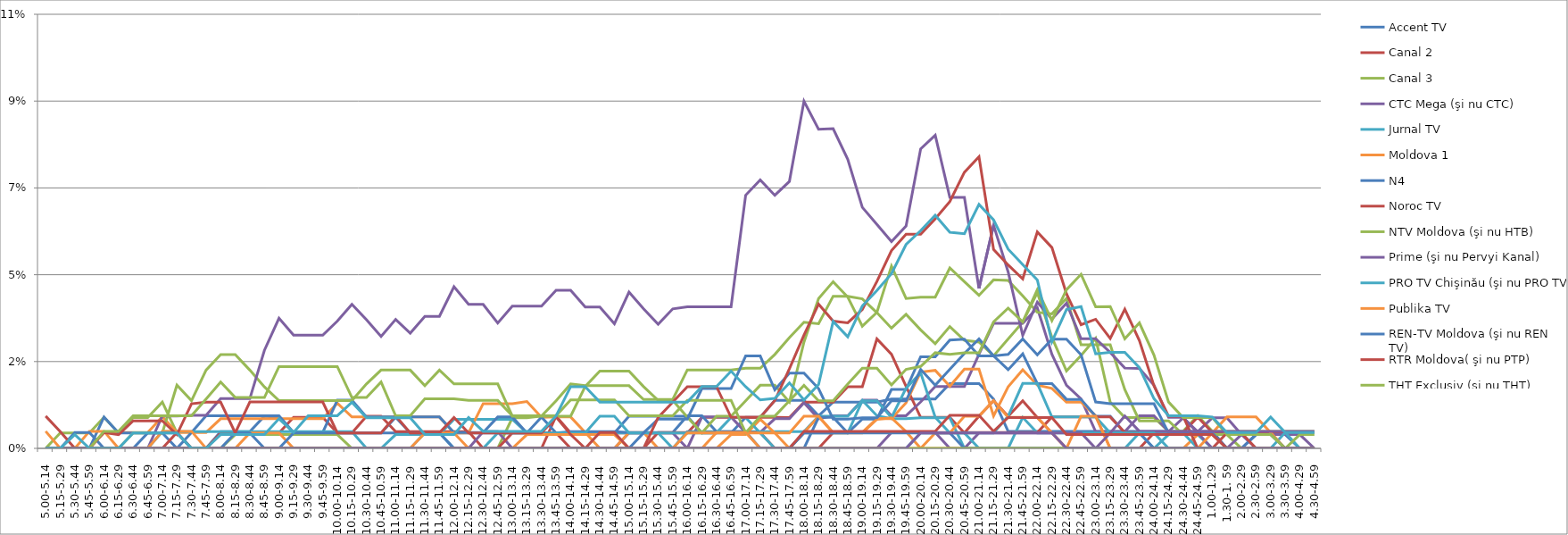
| Category | Accent TV | Canal 2 | Canal 3 | CTC Mega (şi nu CTC) | Jurnal TV | Moldova 1 | N4 | Noroc TV | NTV Moldova (şi nu HTB) | Prime (şi nu Pervyi Kanal) | PRO TV Chişinău (şi nu PRO TV) | Publika TV  | REN-TV Moldova (şi nu REN TV)  | RTR Moldova( şi nu PTP)  | THT Exclusiv (şi nu THT) | TV8 | TVC 21 | TVR MOLDOVA (şi nu TVR) | Canal Regional | Familia Domashniy | ITV | Moldova 2 | Alt canal |
|---|---|---|---|---|---|---|---|---|---|---|---|---|---|---|---|---|---|---|---|---|---|---|---|
| 5.00-5.14 | 0 | 0 | 0 | 0 | 0 | 0 | 0 | 0 | 0 | 0 | 0 | 0.004 | 0 | 0.008 | 0 | 0 | 0 | 0 | 0 | 0 | 0 | 0 | 0 |
| 5.15-5.29 | 0 | 0 | 0.004 | 0 | 0 | 0 | 0 | 0 | 0 | 0 | 0 | 0 | 0 | 0.004 | 0 | 0 | 0 | 0 | 0 | 0 | 0 | 0 | 0 |
| 5.30-5.44 | 0 | 0 | 0.004 | 0 | 0 | 0 | 0 | 0 | 0 | 0 | 0 | 0 | 0.004 | 0 | 0 | 0 | 0 | 0 | 0 | 0 | 0 | 0 | 0.004 |
| 5.45-5.59 | 0 | 0 | 0.004 | 0 | 0 | 0 | 0 | 0 | 0 | 0 | 0 | 0.004 | 0.004 | 0 | 0 | 0 | 0 | 0 | 0 | 0 | 0 | 0 | 0 |
| 6.00-6.14 | 0 | 0 | 0.008 | 0 | 0 | 0.004 | 0.008 | 0 | 0 | 0 | 0 | 0.004 | 0 | 0.004 | 0.004 | 0 | 0 | 0 | 0 | 0 | 0 | 0 | 0 |
| 6.15-6.29 | 0 | 0 | 0.004 | 0 | 0 | 0.004 | 0.004 | 0 | 0 | 0 | 0 | 0 | 0 | 0.004 | 0.004 | 0 | 0 | 0 | 0 | 0 | 0 | 0 | 0 |
| 6.30-6.44 | 0 | 0 | 0.008 | 0 | 0 | 0.004 | 0.004 | 0 | 0.004 | 0 | 0 | 0 | 0 | 0.007 | 0.008 | 0 | 0 | 0 | 0 | 0 | 0 | 0 | 0.004 |
| 6.45-6.59 | 0 | 0 | 0.008 | 0 | 0 | 0.004 | 0.004 | 0 | 0.004 | 0 | 0 | 0 | 0.004 | 0.007 | 0.008 | 0 | 0 | 0 | 0 | 0 | 0 | 0 | 0.004 |
| 7.00-7.14 | 0 | 0 | 0.012 | 0 | 0 | 0.008 | 0.004 | 0 | 0.004 | 0.008 | 0.004 | 0.004 | 0.004 | 0.007 | 0.008 | 0 | 0 | 0 | 0 | 0 | 0 | 0 | 0.004 |
| 7.15-7.29 | 0 | 0 | 0.004 | 0 | 0 | 0.004 | 0 | 0.004 | 0.016 | 0.008 | 0.004 | 0.004 | 0.004 | 0.004 | 0.008 | 0 | 0 | 0 | 0 | 0 | 0 | 0 | 0.004 |
| 7.30-7.44 | 0 | 0 | 0 | 0 | 0 | 0.004 | 0.004 | 0 | 0.012 | 0.009 | 0.004 | 0.004 | 0 | 0.012 | 0.008 | 0 | 0 | 0 | 0 | 0 | 0 | 0 | 0 |
| 7.45-7.59 | 0 | 0 | 0 | 0 | 0 | 0.004 | 0.008 | 0 | 0.02 | 0.009 | 0.004 | 0 | 0 | 0.012 | 0.013 | 0 | 0 | 0 | 0 | 0 | 0 | 0 | 0 |
| 8.00-8.14 | 0.004 | 0.004 | 0 | 0 | 0 | 0.008 | 0.008 | 0 | 0.024 | 0.013 | 0.004 | 0 | 0 | 0.012 | 0.017 | 0 | 0 | 0 | 0 | 0 | 0 | 0 | 0.004 |
| 8.15-8.29 | 0.004 | 0.004 | 0.004 | 0 | 0 | 0.008 | 0.008 | 0 | 0.024 | 0.013 | 0.004 | 0 | 0.004 | 0.004 | 0.013 | 0 | 0 | 0 | 0 | 0 | 0 | 0 | 0.004 |
| 8.30-8.44 | 0.004 | 0.004 | 0.004 | 0 | 0 | 0.008 | 0.008 | 0 | 0.02 | 0.013 | 0.004 | 0.004 | 0.004 | 0.012 | 0.013 | 0 | 0 | 0 | 0 | 0 | 0 | 0 | 0.004 |
| 8.45-8.59 | 0.008 | 0.004 | 0.004 | 0 | 0 | 0.008 | 0.008 | 0 | 0.016 | 0.025 | 0.004 | 0.004 | 0 | 0.012 | 0.013 | 0 | 0 | 0 | 0 | 0 | 0 | 0 | 0.004 |
| 9.00-9.14 | 0.008 | 0.004 | 0.004 | 0 | 0 | 0.008 | 0.008 | 0 | 0.012 | 0.034 | 0.004 | 0.004 | 0 | 0.012 | 0.021 | 0 | 0 | 0 | 0 | 0 | 0 | 0 | 0.008 |
| 9.15-9.29 | 0.004 | 0.008 | 0.004 | 0 | 0 | 0.008 | 0.004 | 0 | 0.012 | 0.029 | 0.004 | 0 | 0.004 | 0.012 | 0.021 | 0 | 0 | 0 | 0 | 0 | 0 | 0 | 0.004 |
| 9.30-9.44 | 0.004 | 0.008 | 0.004 | 0 | 0 | 0.008 | 0.004 | 0 | 0.012 | 0.029 | 0.004 | 0 | 0.004 | 0.012 | 0.021 | 0 | 0 | 0 | 0 | 0 | 0 | 0 | 0.008 |
| 9.45-9.59 | 0.004 | 0.008 | 0.004 | 0 | 0 | 0.008 | 0.004 | 0 | 0.012 | 0.029 | 0.004 | 0 | 0.004 | 0.012 | 0.021 | 0 | 0 | 0 | 0 | 0 | 0 | 0 | 0.008 |
| 10.00-10.14 | 0.004 | 0.004 | 0.004 | 0 | 0 | 0.012 | 0.012 | 0 | 0.012 | 0.033 | 0.004 | 0 | 0.004 | 0.004 | 0.021 | 0 | 0 | 0 | 0 | 0 | 0 | 0 | 0.008 |
| 10.15-10.29 | 0.004 | 0.004 | 0 | 0 | 0 | 0.008 | 0.012 | 0 | 0.012 | 0.037 | 0.004 | 0 | 0.004 | 0.004 | 0.013 | 0 | 0 | 0 | 0 | 0 | 0 | 0 | 0.012 |
| 10.30-10.44 | 0.004 | 0.008 | 0 | 0 | 0 | 0.008 | 0.008 | 0 | 0.017 | 0.033 | 0 | 0 | 0.004 | 0.004 | 0.013 | 0 | 0 | 0 | 0 | 0 | 0 | 0 | 0.008 |
| 10.45-10.59 | 0.004 | 0.008 | 0 | 0 | 0 | 0.008 | 0.008 | 0 | 0.02 | 0.029 | 0 | 0 | 0.004 | 0.004 | 0.017 | 0 | 0 | 0 | 0 | 0 | 0 | 0 | 0.008 |
| 11.00-11.14 | 0.004 | 0.004 | 0 | 0 | 0.004 | 0.008 | 0.008 | 0 | 0.02 | 0.033 | 0 | 0 | 0.008 | 0.008 | 0.008 | 0 | 0 | 0 | 0 | 0 | 0 | 0 | 0.008 |
| 11.15-11.29 | 0.004 | 0.004 | 0 | 0 | 0.004 | 0.008 | 0.008 | 0 | 0.02 | 0.03 | 0 | 0 | 0.004 | 0.004 | 0.008 | 0 | 0 | 0 | 0 | 0 | 0 | 0 | 0.008 |
| 11.30-11.44 | 0.004 | 0.004 | 0 | 0 | 0.004 | 0.008 | 0.008 | 0 | 0.016 | 0.034 | 0.004 | 0.004 | 0.004 | 0.004 | 0.013 | 0 | 0 | 0 | 0 | 0 | 0 | 0 | 0.004 |
| 11.45-11.59 | 0.004 | 0.004 | 0 | 0 | 0.004 | 0.008 | 0.008 | 0 | 0.02 | 0.034 | 0.004 | 0.004 | 0.004 | 0.004 | 0.013 | 0 | 0 | 0 | 0 | 0 | 0 | 0 | 0.004 |
| 12.00-12.14 | 0.004 | 0.004 | 0 | 0 | 0.008 | 0.004 | 0.004 | 0 | 0.017 | 0.042 | 0 | 0.004 | 0 | 0.008 | 0.013 | 0 | 0 | 0 | 0 | 0 | 0 | 0 | 0.004 |
| 12.15-12.29 | 0.004 | 0.004 | 0 | 0 | 0.008 | 0.004 | 0.004 | 0 | 0.017 | 0.037 | 0 | 0 | 0 | 0.004 | 0.012 | 0 | 0 | 0 | 0 | 0 | 0 | 0 | 0.008 |
| 12.30-12.44 | 0.004 | 0 | 0 | 0.004 | 0.008 | 0.012 | 0.004 | 0 | 0.017 | 0.037 | 0 | 0 | 0 | 0.004 | 0.012 | 0 | 0 | 0 | 0 | 0 | 0 | 0 | 0.004 |
| 12.45-12.59 | 0.004 | 0 | 0 | 0.004 | 0.008 | 0.012 | 0.008 | 0 | 0.017 | 0.032 | 0.004 | 0 | 0 | 0.004 | 0.012 | 0 | 0 | 0 | 0 | 0 | 0 | 0 | 0.004 |
| 13.00-13.14 | 0.004 | 0 | 0.008 | 0 | 0.008 | 0.012 | 0.008 | 0.004 | 0.008 | 0.037 | 0.004 | 0 | 0 | 0.004 | 0.008 | 0 | 0 | 0 | 0 | 0 | 0 | 0 | 0.004 |
| 13.15-13.29 | 0.004 | 0 | 0.008 | 0 | 0.004 | 0.012 | 0.004 | 0.004 | 0.008 | 0.037 | 0.004 | 0.004 | 0 | 0.004 | 0.008 | 0 | 0 | 0 | 0 | 0 | 0 | 0 | 0.004 |
| 13.30-13.44 | 0.004 | 0 | 0.008 | 0 | 0.004 | 0.008 | 0.008 | 0.004 | 0.008 | 0.037 | 0.004 | 0.004 | 0 | 0.004 | 0.008 | 0 | 0 | 0 | 0 | 0 | 0 | 0 | 0.004 |
| 13.45-13.59 | 0.004 | 0.008 | 0.012 | 0 | 0.004 | 0.008 | 0.004 | 0.004 | 0.008 | 0.041 | 0.004 | 0.004 | 0 | 0.008 | 0.008 | 0 | 0 | 0 | 0 | 0 | 0 | 0 | 0.008 |
| 14.00-14.14 | 0.004 | 0.004 | 0.017 | 0 | 0.004 | 0.008 | 0.004 | 0 | 0.008 | 0.041 | 0.004 | 0.004 | 0 | 0.004 | 0.013 | 0 | 0 | 0 | 0 | 0 | 0 | 0 | 0.016 |
| 14.15-14.29 | 0.004 | 0.004 | 0.016 | 0 | 0.004 | 0.004 | 0.004 | 0 | 0.016 | 0.037 | 0.004 | 0.004 | 0 | 0 | 0.013 | 0 | 0 | 0 | 0 | 0 | 0 | 0 | 0.016 |
| 14.30-14.44 | 0.004 | 0.004 | 0.016 | 0 | 0.004 | 0 | 0.004 | 0 | 0.02 | 0.037 | 0.008 | 0.004 | 0 | 0.004 | 0.013 | 0 | 0 | 0 | 0 | 0 | 0 | 0 | 0.012 |
| 14.45-14.59 | 0.004 | 0.004 | 0.016 | 0 | 0.004 | 0 | 0.004 | 0 | 0.02 | 0.032 | 0.008 | 0.004 | 0 | 0.004 | 0.013 | 0 | 0 | 0 | 0 | 0 | 0 | 0 | 0.012 |
| 15.00-15.14 | 0.008 | 0.004 | 0.016 | 0.004 | 0.004 | 0.004 | 0.004 | 0 | 0.02 | 0.04 | 0.004 | 0 | 0 | 0 | 0.008 | 0 | 0 | 0 | 0 | 0 | 0 | 0 | 0.012 |
| 15.15-15.29 | 0.008 | 0.004 | 0.013 | 0.004 | 0.004 | 0.004 | 0.004 | 0 | 0.016 | 0.036 | 0.004 | 0 | 0.004 | 0 | 0.008 | 0 | 0 | 0 | 0 | 0 | 0 | 0 | 0.012 |
| 15.30-15.44 | 0.008 | 0.004 | 0.013 | 0.004 | 0.004 | 0 | 0.004 | 0.004 | 0.012 | 0.032 | 0.004 | 0 | 0.008 | 0.008 | 0.008 | 0 | 0 | 0 | 0 | 0 | 0 | 0 | 0.012 |
| 15.45-15.59 | 0.008 | 0.004 | 0.013 | 0.004 | 0 | 0 | 0.004 | 0.004 | 0.012 | 0.036 | 0.004 | 0 | 0.008 | 0.012 | 0.008 | 0 | 0 | 0 | 0 | 0 | 0 | 0 | 0.012 |
| 16.00-16.14 | 0.008 | 0.004 | 0.02 | 0 | 0.004 | 0 | 0.008 | 0.004 | 0.008 | 0.037 | 0.004 | 0.004 | 0.008 | 0.016 | 0.012 | 0 | 0 | 0 | 0 | 0 | 0 | 0 | 0.012 |
| 16.15-16.29 | 0.004 | 0.008 | 0.02 | 0.008 | 0.004 | 0 | 0.008 | 0.004 | 0.004 | 0.037 | 0.004 | 0.004 | 0.015 | 0.016 | 0.012 | 0 | 0 | 0 | 0 | 0 | 0 | 0 | 0.016 |
| 16.30-16.44 | 0.004 | 0.008 | 0.02 | 0.008 | 0.004 | 0 | 0.004 | 0.004 | 0.008 | 0.037 | 0.004 | 0.004 | 0.015 | 0.016 | 0.012 | 0 | 0 | 0.004 | 0 | 0 | 0 | 0 | 0.016 |
| 16.45-16.59 | 0.004 | 0.008 | 0.02 | 0.008 | 0.004 | 0.004 | 0.004 | 0.004 | 0.008 | 0.037 | 0.008 | 0.004 | 0.015 | 0.008 | 0.012 | 0 | 0 | 0.004 | 0 | 0 | 0 | 0 | 0.02 |
| 17.00-17.14 | 0.008 | 0.008 | 0.021 | 0.004 | 0.004 | 0.004 | 0.004 | 0.004 | 0.012 | 0.066 | 0.008 | 0.004 | 0.024 | 0.008 | 0.004 | 0 | 0 | 0.004 | 0 | 0 | 0 | 0 | 0.016 |
| 17.15-17.29 | 0.008 | 0.008 | 0.021 | 0.004 | 0.004 | 0.008 | 0 | 0.004 | 0.016 | 0.07 | 0.004 | 0.004 | 0.024 | 0.008 | 0.008 | 0 | 0 | 0 | 0 | 0 | 0 | 0 | 0.013 |
| 17.30-17.44 | 0.012 | 0.008 | 0.024 | 0.008 | 0.004 | 0.004 | 0 | 0 | 0.016 | 0.066 | 0 | 0.004 | 0.015 | 0.012 | 0.008 | 0 | 0 | 0 | 0 | 0 | 0 | 0 | 0.013 |
| 17.45-17.59 | 0.012 | 0.008 | 0.029 | 0.008 | 0.004 | 0 | 0 | 0 | 0.012 | 0.069 | 0 | 0.004 | 0.02 | 0.021 | 0.012 | 0 | 0 | 0 | 0 | 0 | 0 | 0 | 0.017 |
| 18.00-18.14 | 0.012 | 0.012 | 0.033 | 0.012 | 0.004 | 0.004 | 0 | 0 | 0.028 | 0.09 | 0.004 | 0.008 | 0.02 | 0.029 | 0.016 | 0 | 0 | 0 | 0.004 | 0.004 | 0 | 0 | 0.013 |
| 18.15-18.29 | 0.008 | 0.012 | 0.032 | 0.008 | 0.008 | 0.008 | 0.008 | 0 | 0.039 | 0.083 | 0.004 | 0.008 | 0.015 | 0.037 | 0.012 | 0 | 0 | 0 | 0.004 | 0.004 | 0 | 0 | 0.017 |
| 18.30-18.44 | 0.012 | 0.012 | 0.039 | 0.008 | 0.008 | 0.004 | 0.008 | 0.004 | 0.043 | 0.083 | 0.004 | 0.004 | 0.008 | 0.033 | 0.012 | 0 | 0 | 0 | 0.004 | 0.004 | 0 | 0 | 0.033 |
| 18.45-18.59 | 0.012 | 0.016 | 0.039 | 0.008 | 0.008 | 0.004 | 0.004 | 0.004 | 0.039 | 0.075 | 0.004 | 0.004 | 0.008 | 0.033 | 0.017 | 0 | 0 | 0 | 0.004 | 0.004 | 0 | 0 | 0.029 |
| 19.00-19.14 | 0.012 | 0.016 | 0.039 | 0.012 | 0.012 | 0.004 | 0.008 | 0.004 | 0.032 | 0.062 | 0.012 | 0.004 | 0.008 | 0.036 | 0.021 | 0 | 0 | 0 | 0.004 | 0.004 | 0 | 0 | 0.037 |
| 19.15-19.29 | 0.012 | 0.028 | 0.035 | 0.012 | 0.008 | 0.008 | 0.008 | 0.004 | 0.035 | 0.058 | 0.012 | 0.008 | 0.008 | 0.043 | 0.021 | 0 | 0 | 0 | 0.004 | 0.004 | 0 | 0 | 0.041 |
| 19.30-19.44 | 0.013 | 0.024 | 0.031 | 0.008 | 0.008 | 0.008 | 0.015 | 0.004 | 0.047 | 0.054 | 0.008 | 0.008 | 0.012 | 0.051 | 0.016 | 0.004 | 0 | 0 | 0.004 | 0.004 | 0 | 0 | 0.045 |
| 19.45-19.59 | 0.013 | 0.016 | 0.035 | 0.008 | 0.008 | 0.012 | 0.015 | 0.004 | 0.039 | 0.058 | 0.016 | 0.004 | 0.012 | 0.056 | 0.02 | 0.004 | 0 | 0 | 0.004 | 0.004 | 0 | 0 | 0.053 |
| 20.00-20.14 | 0.013 | 0.008 | 0.031 | 0.012 | 0.008 | 0.02 | 0.024 | 0.004 | 0.039 | 0.078 | 0.02 | 0 | 0.02 | 0.056 | 0.021 | 0.004 | 0.004 | 0 | 0.004 | 0.004 | 0 | 0.004 | 0.056 |
| 20.15-20.29 | 0.013 | 0.008 | 0.027 | 0.016 | 0.008 | 0.02 | 0.024 | 0.004 | 0.039 | 0.081 | 0.008 | 0.004 | 0.016 | 0.06 | 0.025 | 0.004 | 0.004 | 0 | 0.004 | 0.004 | 0 | 0.004 | 0.06 |
| 20.30-20.44 | 0.017 | 0.008 | 0.032 | 0.016 | 0.008 | 0.016 | 0.028 | 0.004 | 0.047 | 0.065 | 0.004 | 0.004 | 0.02 | 0.064 | 0.024 | 0 | 0.004 | 0 | 0.004 | 0.009 | 0 | 0.004 | 0.056 |
| 20.45-20.59 | 0.017 | 0.004 | 0.028 | 0.016 | 0 | 0.021 | 0.028 | 0.004 | 0.043 | 0.065 | 0.004 | 0.008 | 0.025 | 0.072 | 0.025 | 0 | 0.004 | 0 | 0 | 0.009 | 0 | 0.004 | 0.056 |
| 21.00-21.14 | 0.017 | 0.008 | 0.028 | 0.024 | 0 | 0.021 | 0.024 | 0.004 | 0.04 | 0.041 | 0.004 | 0.008 | 0.028 | 0.076 | 0.025 | 0.004 | 0 | 0 | 0 | 0.009 | 0 | 0.004 | 0.063 |
| 21.15-21.29 | 0.013 | 0.012 | 0.024 | 0.032 | 0 | 0.008 | 0.024 | 0.004 | 0.044 | 0.058 | 0.004 | 0.012 | 0.024 | 0.052 | 0.033 | 0.004 | 0 | 0 | 0 | 0.004 | 0 | 0.004 | 0.059 |
| 21.30-21.44 | 0.004 | 0.008 | 0.028 | 0.032 | 0 | 0.016 | 0.02 | 0.004 | 0.044 | 0.046 | 0.008 | 0.008 | 0.024 | 0.048 | 0.036 | 0.004 | 0 | 0 | 0 | 0.008 | 0 | 0.004 | 0.052 |
| 21.45-21.59 | 0.004 | 0.012 | 0.033 | 0.032 | 0.008 | 0.02 | 0.025 | 0.004 | 0.04 | 0.029 | 0.017 | 0.008 | 0.028 | 0.044 | 0.033 | 0.004 | 0 | 0 | 0 | 0.008 | 0 | 0.004 | 0.048 |
| 22.00-22.14 | 0.004 | 0.008 | 0.04 | 0.036 | 0.004 | 0.016 | 0.017 | 0.004 | 0.035 | 0.038 | 0.017 | 0.008 | 0.024 | 0.056 | 0.041 | 0.004 | 0 | 0 | 0 | 0.008 | 0 | 0.004 | 0.044 |
| 22.15-22.29 | 0.004 | 0.004 | 0.029 | 0.024 | 0.004 | 0.016 | 0.017 | 0.008 | 0.035 | 0.034 | 0.008 | 0.004 | 0.028 | 0.052 | 0.033 | 0.004 | 0 | 0 | 0 | 0.008 | 0 | 0.004 | 0.028 |
| 22.30-22.44 | 0.004 | 0 | 0.02 | 0.016 | 0.004 | 0.012 | 0.013 | 0.008 | 0.039 | 0.038 | 0.008 | 0 | 0.028 | 0.04 | 0.041 | 0.004 | 0 | 0 | 0 | 0.004 | 0 | 0 | 0.036 |
| 22.45-22.59 | 0.004 | 0 | 0.024 | 0.013 | 0.004 | 0.012 | 0.013 | 0.008 | 0.027 | 0.028 | 0.008 | 0.008 | 0.024 | 0.032 | 0.045 | 0.004 | 0 | 0 | 0 | 0.004 | 0 | 0 | 0.037 |
| 23.00-23.14 | 0.004 | 0 | 0.029 | 0.004 | 0.004 | 0.008 | 0.008 | 0.008 | 0.027 | 0.028 | 0.008 | 0.008 | 0.012 | 0.033 | 0.037 | 0 | 0 | 0 | 0 | 0.004 | 0 | 0 | 0.024 |
| 23.15-23.29 | 0.004 | 0 | 0.012 | 0.004 | 0.004 | 0 | 0.008 | 0.008 | 0.027 | 0.025 | 0.004 | 0 | 0.012 | 0.028 | 0.037 | 0.004 | 0 | 0 | 0 | 0.004 | 0 | 0 | 0.025 |
| 23.30-23.44 | 0.004 | 0 | 0.008 | 0.004 | 0.004 | 0 | 0.004 | 0.004 | 0.015 | 0.021 | 0.004 | 0 | 0.012 | 0.036 | 0.028 | 0.008 | 0 | 0 | 0 | 0.004 | 0 | 0 | 0.025 |
| 23.45-23.59 | 0.004 | 0 | 0.008 | 0.008 | 0.004 | 0 | 0.004 | 0.004 | 0.007 | 0.021 | 0.004 | 0 | 0.012 | 0.028 | 0.033 | 0.004 | 0.004 | 0 | 0 | 0.004 | 0 | 0 | 0.021 |
| 24.00-24.14 | 0.004 | 0.004 | 0.008 | 0.008 | 0 | 0 | 0 | 0.004 | 0.007 | 0.016 | 0.004 | 0 | 0.012 | 0.016 | 0.024 | 0.004 | 0.004 | 0 | 0 | 0.004 | 0 | 0 | 0.013 |
| 24.15-24.29 | 0.004 | 0.004 | 0.004 | 0.004 | 0.004 | 0 | 0 | 0.004 | 0.007 | 0.008 | 0.004 | 0 | 0.004 | 0.008 | 0.012 | 0.004 | 0 | 0 | 0 | 0.004 | 0 | 0 | 0.008 |
| 24.30-24.44 | 0.004 | 0.004 | 0.004 | 0.008 | 0.004 | 0 | 0 | 0.004 | 0.004 | 0.008 | 0.004 | 0 | 0.004 | 0.008 | 0.008 | 0.004 | 0 | 0 | 0 | 0.004 | 0 | 0 | 0.008 |
| 24.45-24.59 | 0.004 | 0.004 | 0.008 | 0.004 | 0.004 | 0.004 | 0 | 0.008 | 0.004 | 0.004 | 0 | 0 | 0.004 | 0 | 0.008 | 0.004 | 0 | 0 | 0 | 0.004 | 0 | 0 | 0.008 |
| 1.00-1.29 | 0.004 | 0.004 | 0.004 | 0.008 | 0 | 0.004 | 0 | 0.004 | 0.004 | 0 | 0 | 0.004 | 0.004 | 0 | 0.008 | 0.004 | 0 | 0 | 0 | 0.004 | 0 | 0 | 0.008 |
| 1.30-1. 59 | 0 | 0 | 0.004 | 0.008 | 0 | 0 | 0 | 0.004 | 0.004 | 0 | 0 | 0.008 | 0 | 0.004 | 0.004 | 0.004 | 0 | 0 | 0 | 0 | 0 | 0 | 0.004 |
| 2.00-2.29 | 0 | 0 | 0.004 | 0.004 | 0 | 0 | 0 | 0.004 | 0 | 0.004 | 0 | 0.008 | 0 | 0.004 | 0.004 | 0.004 | 0 | 0 | 0 | 0 | 0 | 0 | 0.004 |
| 2.30-2.59 | 0 | 0 | 0.004 | 0 | 0 | 0 | 0.004 | 0.004 | 0 | 0.004 | 0 | 0.008 | 0.004 | 0 | 0.004 | 0.004 | 0 | 0 | 0 | 0 | 0 | 0 | 0.004 |
| 3.00-3.29 | 0 | 0 | 0.004 | 0 | 0 | 0 | 0.004 | 0.004 | 0 | 0.004 | 0 | 0.004 | 0.004 | 0 | 0.004 | 0.004 | 0 | 0 | 0 | 0 | 0 | 0 | 0.008 |
| 3.30-3.59 | 0 | 0 | 0.004 | 0 | 0 | 0 | 0.004 | 0.004 | 0 | 0.004 | 0.004 | 0 | 0 | 0 | 0 | 0.004 | 0 | 0 | 0 | 0 | 0 | 0 | 0.004 |
| 4.00-4.29 | 0 | 0 | 0.004 | 0 | 0 | 0 | 0 | 0.004 | 0 | 0.004 | 0 | 0 | 0 | 0 | 0.004 | 0.004 | 0 | 0 | 0 | 0 | 0 | 0 | 0.004 |
| 4.30-4.59 | 0 | 0 | 0.004 | 0 | 0 | 0 | 0 | 0.004 | 0 | 0 | 0 | 0 | 0 | 0 | 0.004 | 0.004 | 0 | 0 | 0 | 0 | 0 | 0 | 0.004 |